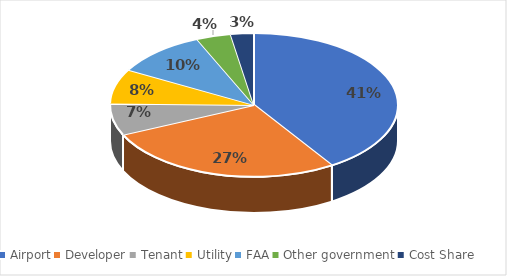
| Category | Series 0 |
|---|---|
| Airport | 63 |
| Developer | 42 |
| Tenant | 11 |
| Utility | 12 |
| FAA | 16 |
| Other government | 6 |
| Cost Share | 4 |